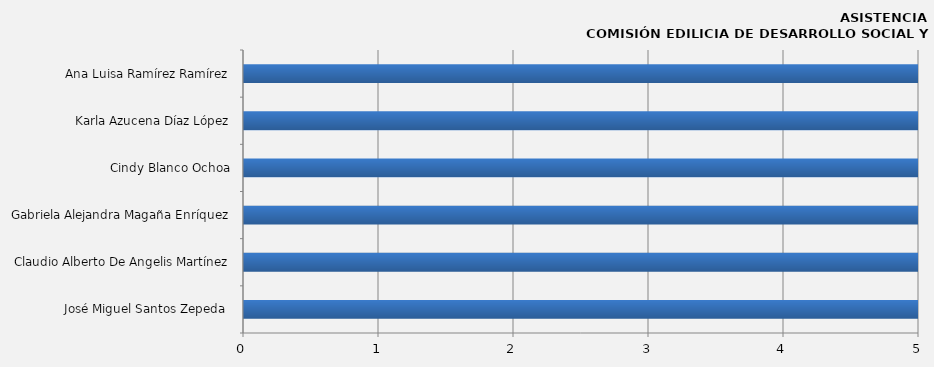
| Category | Series 0 |
|---|---|
| José Miguel Santos Zepeda  | 13 |
| Claudio Alberto De Angelis Martínez | 11 |
| Gabriela Alejandra Magaña Enríquez | 11 |
| Cindy Blanco Ochoa | 8 |
| Karla Azucena Díaz López | 10 |
| Ana Luisa Ramírez Ramírez | 10 |